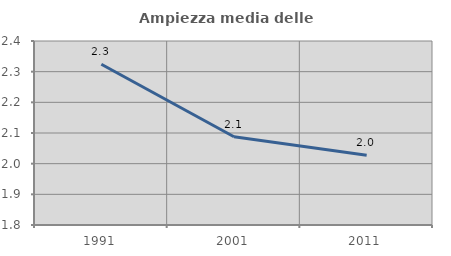
| Category | Ampiezza media delle famiglie |
|---|---|
| 1991.0 | 2.324 |
| 2001.0 | 2.088 |
| 2011.0 | 2.028 |